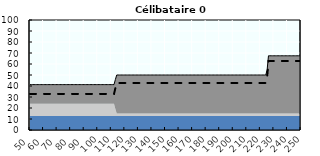
| Category | Coin fiscal marginal (somme des composantes) | Taux d’imposition marginal net |
|---|---|---|
| 50.0 | 41.278 | 32.74 |
| 51.0 | 41.278 | 32.74 |
| 52.0 | 41.278 | 32.74 |
| 53.0 | 41.278 | 32.74 |
| 54.0 | 41.278 | 32.74 |
| 55.0 | 41.278 | 32.74 |
| 56.0 | 41.278 | 32.74 |
| 57.0 | 41.278 | 32.74 |
| 58.0 | 41.278 | 32.74 |
| 59.0 | 41.278 | 32.74 |
| 60.0 | 41.278 | 32.74 |
| 61.0 | 41.278 | 32.74 |
| 62.0 | 41.278 | 32.74 |
| 63.0 | 41.278 | 32.74 |
| 64.0 | 41.278 | 32.74 |
| 65.0 | 41.278 | 32.74 |
| 66.0 | 41.278 | 32.74 |
| 67.0 | 41.278 | 32.74 |
| 68.0 | 41.278 | 32.74 |
| 69.0 | 41.278 | 32.74 |
| 70.0 | 41.278 | 32.74 |
| 71.0 | 41.278 | 32.74 |
| 72.0 | 41.278 | 32.74 |
| 73.0 | 41.278 | 32.74 |
| 74.0 | 41.278 | 32.74 |
| 75.0 | 41.278 | 32.74 |
| 76.0 | 41.278 | 32.74 |
| 77.0 | 41.278 | 32.74 |
| 78.0 | 41.278 | 32.74 |
| 79.0 | 41.278 | 32.74 |
| 80.0 | 41.278 | 32.74 |
| 81.0 | 41.278 | 32.74 |
| 82.0 | 41.278 | 32.74 |
| 83.0 | 41.278 | 32.74 |
| 84.0 | 41.278 | 32.74 |
| 85.0 | 41.278 | 32.74 |
| 86.0 | 41.278 | 32.74 |
| 87.0 | 41.278 | 32.74 |
| 88.0 | 41.278 | 32.74 |
| 89.0 | 41.278 | 32.74 |
| 90.0 | 41.278 | 32.74 |
| 91.0 | 41.278 | 32.74 |
| 92.0 | 41.278 | 32.74 |
| 93.0 | 41.278 | 32.74 |
| 94.0 | 41.278 | 32.74 |
| 95.0 | 41.278 | 32.74 |
| 96.0 | 41.278 | 32.74 |
| 97.0 | 41.278 | 32.74 |
| 98.0 | 41.278 | 32.74 |
| 99.0 | 41.278 | 32.74 |
| 100.0 | 41.278 | 32.74 |
| 101.0 | 41.278 | 32.74 |
| 102.0 | 41.278 | 32.74 |
| 103.0 | 41.278 | 32.74 |
| 104.0 | 41.278 | 32.74 |
| 105.0 | 41.278 | 32.74 |
| 106.0 | 41.278 | 32.74 |
| 107.0 | 41.278 | 32.74 |
| 108.0 | 41.278 | 32.74 |
| 109.0 | 41.278 | 32.74 |
| 110.0 | 41.278 | 32.74 |
| 111.0 | 41.278 | 32.74 |
| 112.0 | 41.278 | 32.74 |
| 113.0 | 45.858 | 37.986 |
| 114.0 | 50.009 | 42.74 |
| 115.0 | 50.009 | 42.74 |
| 116.0 | 50.009 | 42.74 |
| 117.0 | 50.009 | 42.74 |
| 118.0 | 50.009 | 42.74 |
| 119.0 | 50.009 | 42.74 |
| 120.0 | 50.009 | 42.74 |
| 121.0 | 50.009 | 42.74 |
| 122.0 | 50.009 | 42.74 |
| 123.0 | 50.009 | 42.74 |
| 124.0 | 50.009 | 42.74 |
| 125.0 | 50.009 | 42.74 |
| 126.0 | 50.009 | 42.74 |
| 127.0 | 50.009 | 42.74 |
| 128.0 | 50.009 | 42.74 |
| 129.0 | 50.009 | 42.74 |
| 130.0 | 50.009 | 42.74 |
| 131.0 | 50.009 | 42.74 |
| 132.0 | 50.009 | 42.74 |
| 133.0 | 50.009 | 42.74 |
| 134.0 | 50.009 | 42.74 |
| 135.0 | 50.009 | 42.74 |
| 136.0 | 50.009 | 42.74 |
| 137.0 | 50.009 | 42.74 |
| 138.0 | 50.009 | 42.74 |
| 139.0 | 50.009 | 42.74 |
| 140.0 | 50.009 | 42.74 |
| 141.0 | 50.009 | 42.74 |
| 142.0 | 50.009 | 42.74 |
| 143.0 | 50.009 | 42.74 |
| 144.0 | 50.009 | 42.74 |
| 145.0 | 50.009 | 42.74 |
| 146.0 | 50.009 | 42.74 |
| 147.0 | 50.009 | 42.74 |
| 148.0 | 50.009 | 42.74 |
| 149.0 | 50.009 | 42.74 |
| 150.0 | 50.009 | 42.74 |
| 151.0 | 50.009 | 42.74 |
| 152.0 | 50.009 | 42.74 |
| 153.0 | 50.009 | 42.74 |
| 154.0 | 50.009 | 42.74 |
| 155.0 | 50.009 | 42.74 |
| 156.0 | 50.009 | 42.74 |
| 157.0 | 50.009 | 42.74 |
| 158.0 | 50.009 | 42.74 |
| 159.0 | 50.009 | 42.74 |
| 160.0 | 50.009 | 42.74 |
| 161.0 | 50.009 | 42.74 |
| 162.0 | 50.009 | 42.74 |
| 163.0 | 50.009 | 42.74 |
| 164.0 | 50.009 | 42.74 |
| 165.0 | 50.009 | 42.74 |
| 166.0 | 50.009 | 42.74 |
| 167.0 | 50.009 | 42.74 |
| 168.0 | 50.009 | 42.74 |
| 169.0 | 50.009 | 42.74 |
| 170.0 | 50.009 | 42.74 |
| 171.0 | 50.009 | 42.74 |
| 172.0 | 50.009 | 42.74 |
| 173.0 | 50.009 | 42.74 |
| 174.0 | 50.009 | 42.74 |
| 175.0 | 50.009 | 42.74 |
| 176.0 | 50.009 | 42.74 |
| 177.0 | 50.009 | 42.74 |
| 178.0 | 50.009 | 42.74 |
| 179.0 | 50.009 | 42.74 |
| 180.0 | 50.009 | 42.74 |
| 181.0 | 50.009 | 42.74 |
| 182.0 | 50.009 | 42.74 |
| 183.0 | 50.009 | 42.74 |
| 184.0 | 50.009 | 42.74 |
| 185.0 | 50.009 | 42.74 |
| 186.0 | 50.009 | 42.74 |
| 187.0 | 50.009 | 42.74 |
| 188.0 | 50.009 | 42.74 |
| 189.0 | 50.009 | 42.74 |
| 190.0 | 50.009 | 42.74 |
| 191.0 | 50.009 | 42.74 |
| 192.0 | 50.009 | 42.74 |
| 193.0 | 50.009 | 42.74 |
| 194.0 | 50.009 | 42.74 |
| 195.0 | 50.009 | 42.74 |
| 196.0 | 50.009 | 42.74 |
| 197.0 | 50.009 | 42.74 |
| 198.0 | 50.009 | 42.74 |
| 199.0 | 50.009 | 42.74 |
| 200.0 | 50.009 | 42.74 |
| 201.0 | 50.009 | 42.74 |
| 202.0 | 50.009 | 42.74 |
| 203.0 | 50.009 | 42.74 |
| 204.0 | 50.009 | 42.74 |
| 205.0 | 50.009 | 42.74 |
| 206.0 | 50.009 | 42.74 |
| 207.0 | 50.009 | 42.74 |
| 208.0 | 50.009 | 42.74 |
| 209.0 | 50.009 | 42.74 |
| 210.0 | 50.009 | 42.74 |
| 211.0 | 50.009 | 42.74 |
| 212.0 | 50.009 | 42.74 |
| 213.0 | 50.009 | 42.74 |
| 214.0 | 50.009 | 42.74 |
| 215.0 | 50.009 | 42.74 |
| 216.0 | 50.009 | 42.74 |
| 217.0 | 50.009 | 42.74 |
| 218.0 | 50.009 | 42.74 |
| 219.0 | 50.009 | 42.74 |
| 220.0 | 50.009 | 42.74 |
| 221.0 | 50.009 | 42.74 |
| 222.0 | 50.009 | 42.74 |
| 223.0 | 50.009 | 42.74 |
| 224.0 | 50.009 | 42.74 |
| 225.0 | 54.691 | 48.103 |
| 226.0 | 67.47 | 62.74 |
| 227.0 | 67.47 | 62.74 |
| 228.0 | 67.47 | 62.74 |
| 229.0 | 67.47 | 62.74 |
| 230.0 | 67.47 | 62.74 |
| 231.0 | 67.47 | 62.74 |
| 232.0 | 67.47 | 62.74 |
| 233.0 | 67.47 | 62.74 |
| 234.0 | 67.47 | 62.74 |
| 235.0 | 67.47 | 62.74 |
| 236.0 | 67.47 | 62.74 |
| 237.0 | 67.47 | 62.74 |
| 238.0 | 67.47 | 62.74 |
| 239.0 | 67.47 | 62.74 |
| 240.0 | 67.47 | 62.74 |
| 241.0 | 67.47 | 62.74 |
| 242.0 | 67.47 | 62.74 |
| 243.0 | 67.47 | 62.74 |
| 244.0 | 67.47 | 62.74 |
| 245.0 | 67.47 | 62.74 |
| 246.0 | 67.47 | 62.74 |
| 247.0 | 67.47 | 62.74 |
| 248.0 | 67.47 | 62.74 |
| 249.0 | 67.47 | 62.74 |
| 250.0 | 67.47 | 62.74 |